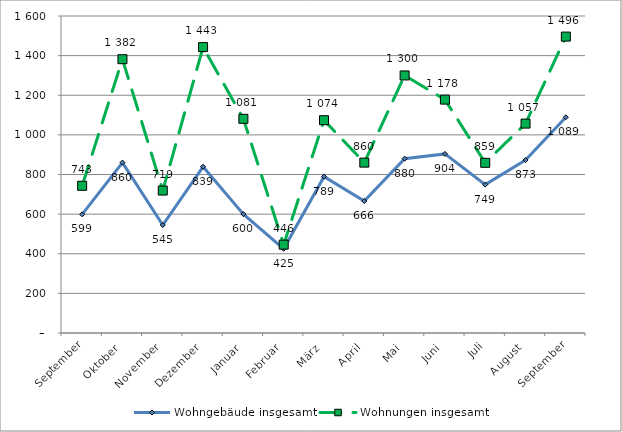
| Category | Wohngebäude insgesamt | Wohnungen insgesamt |
|---|---|---|
| September | 599 | 743 |
| Oktober | 860 | 1382 |
| November | 545 | 719 |
| Dezember | 839 | 1443 |
| Januar | 600 | 1081 |
| Februar | 425 | 446 |
| März | 789 | 1074 |
| April | 666 | 860 |
| Mai | 880 | 1300 |
| Juni | 904 | 1178 |
| Juli | 749 | 859 |
| August | 873 | 1057 |
| September | 1089 | 1496 |